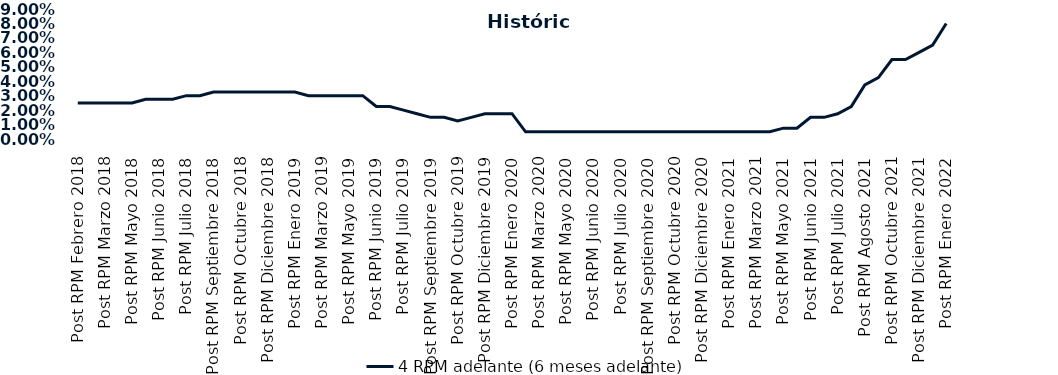
| Category | 4 RPM adelante (6 meses adelante) |
|---|---|
| Post RPM Febrero 2018 | 0.025 |
| Pre RPM Marzo 2018 | 0.025 |
| Post RPM Marzo 2018 | 0.025 |
| Pre RPM Mayo 2018 | 0.025 |
| Post RPM Mayo 2018 | 0.025 |
| Pre RPM Junio 2018 | 0.028 |
| Post RPM Junio 2018 | 0.028 |
| Pre RPM Julio 2018 | 0.028 |
| Post RPM Julio 2018 | 0.03 |
| Pre RPM Septiembre 2018 | 0.03 |
| Post RPM Septiembre 2018 | 0.032 |
| Pre RPM Octubre 2018 | 0.032 |
| Post RPM Octubre 2018 | 0.032 |
| Pre RPM Diciembre 2018 | 0.032 |
| Post RPM Diciembre 2018 | 0.032 |
| Pre RPM Enero 2019 | 0.032 |
| Post RPM Enero 2019 | 0.032 |
| Pre RPM Marzo 2019 | 0.03 |
| Post RPM Marzo 2019 | 0.03 |
| Pre RPM Mayo 2019 | 0.03 |
| Post RPM Mayo 2019 | 0.03 |
| Pre RPM Junio 2019 | 0.03 |
| Post RPM Junio 2019 | 0.022 |
| Pre RPM Julio 2019 | 0.022 |
| Post RPM Julio 2019 | 0.02 |
| Pre RPM Septiembre 2019 | 0.018 |
| Post RPM Septiembre 2019 | 0.015 |
| Pre RPM Octubre 2019 | 0.015 |
| Post RPM Octubre 2019 | 0.012 |
| Pre RPM Diciembre 2019 | 0.015 |
| Post RPM Diciembre 2019 | 0.018 |
| Pre RPM Enero 2020 | 0.018 |
| Post RPM Enero 2020 | 0.018 |
| Pre RPM Marzo 2020 | 0.005 |
| Post RPM Marzo 2020 | 0.005 |
| Pre RPM Mayo 2020 | 0.005 |
| Post RPM Mayo 2020 | 0.005 |
| Pre RPM Junio 2020 | 0.005 |
| Post RPM Junio 2020 | 0.005 |
| Pre RPM Julio 2020 | 0.005 |
| Post RPM Julio 2020 | 0.005 |
| Pre RPM Septiembre 2020 | 0.005 |
| Post RPM Septiembre 2020 | 0.005 |
| Pre RPM Octubre 2020 | 0.005 |
| Post RPM Octubre 2020 | 0.005 |
| Pre RPM Diciembre 2020 | 0.005 |
| Post RPM Diciembre 2020 | 0.005 |
| Pre RPM Enero 2021 | 0.005 |
| Post RPM Enero 2021 | 0.005 |
| Pre RPM Marzo 2021 | 0.005 |
| Post RPM Marzo 2021 | 0.005 |
| Pre RPM Mayo 2021 | 0.005 |
| Post RPM Mayo 2021 | 0.008 |
| Pre RPM Junio 2021 | 0.008 |
| Post RPM Junio 2021 | 0.015 |
| Pre RPM Julio 2021 | 0.015 |
| Post RPM Julio 2021 | 0.018 |
| Pre RPM Agosto 2021 | 0.022 |
| Post RPM Agosto 2021 | 0.038 |
| Pre RPM Octubre 2021 | 0.042 |
| Post RPM Octubre 2021 | 0.055 |
| Pre RPM Diciembre 2021 | 0.055 |
| Post RPM Diciembre 2021 | 0.06 |
| Pre RPM Enero 2022 | 0.065 |
| Post RPM Enero 2022 | 0.08 |